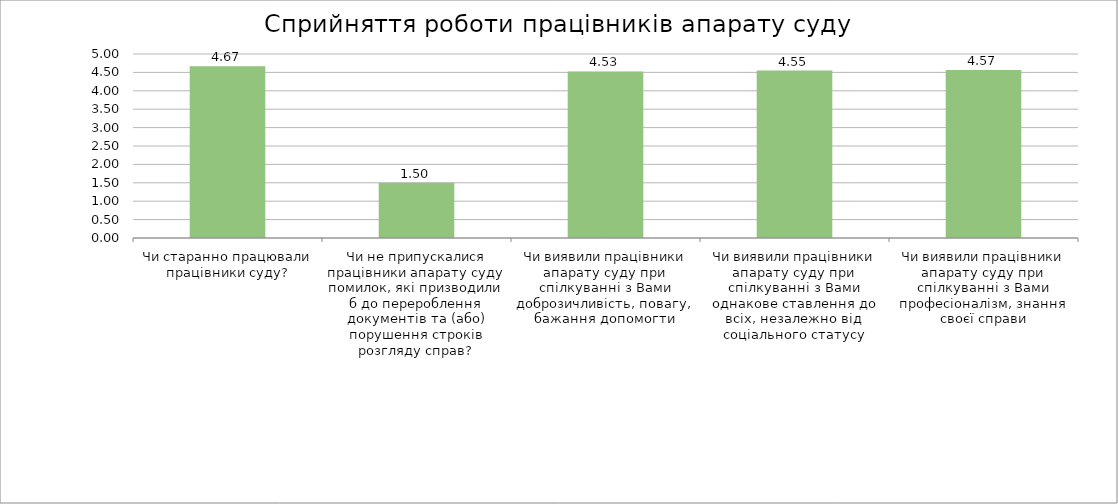
| Category | Series 0 |
|---|---|
| Чи старанно працювали працівники суду? | 4.667 |
| Чи не припускалися працівники апарату суду помилок, які призводили б до перероблення документів та (або) порушення строків розгляду справ? | 1.5 |
| Чи виявили працівники апарату суду при спілкуванні з Вами доброзичливість, повагу, бажання допомогти | 4.525 |
| Чи виявили працівники апарату суду при спілкуванні з Вами однакове ставлення до всіх, незалежно від соціального статусу | 4.55 |
| Чи виявили працівники апарату суду при спілкуванні з Вами професіоналізм, знання своєї справи | 4.568 |